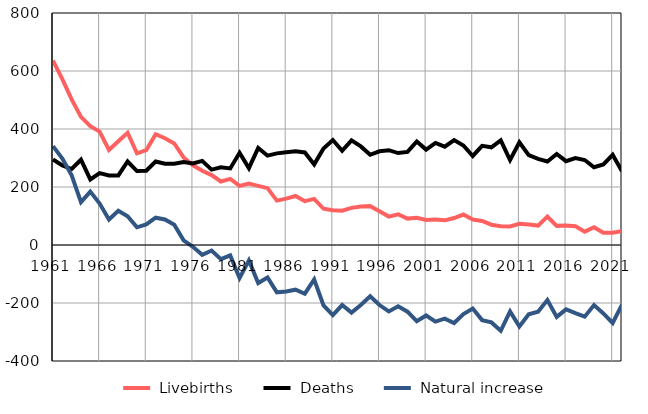
| Category |  Livebirths |  Deaths |  Natural increase |
|---|---|---|---|
| 1961.0 | 636 | 295 | 341 |
| 1962.0 | 572 | 274 | 298 |
| 1963.0 | 502 | 262 | 240 |
| 1964.0 | 442 | 294 | 148 |
| 1965.0 | 410 | 226 | 184 |
| 1966.0 | 391 | 248 | 143 |
| 1967.0 | 328 | 240 | 88 |
| 1968.0 | 358 | 240 | 118 |
| 1969.0 | 387 | 288 | 99 |
| 1970.0 | 316 | 255 | 61 |
| 1971.0 | 327 | 256 | 71 |
| 1972.0 | 382 | 288 | 94 |
| 1973.0 | 368 | 280 | 88 |
| 1974.0 | 350 | 280 | 70 |
| 1975.0 | 302 | 286 | 16 |
| 1976.0 | 275 | 281 | -6 |
| 1977.0 | 256 | 290 | -34 |
| 1978.0 | 241 | 260 | -19 |
| 1979.0 | 219 | 268 | -49 |
| 1980.0 | 228 | 264 | -36 |
| 1981.0 | 204 | 318 | -114 |
| 1982.0 | 212 | 265 | -53 |
| 1983.0 | 204 | 335 | -131 |
| 1984.0 | 196 | 308 | -112 |
| 1985.0 | 153 | 316 | -163 |
| 1986.0 | 160 | 320 | -160 |
| 1987.0 | 169 | 323 | -154 |
| 1988.0 | 151 | 319 | -168 |
| 1989.0 | 159 | 278 | -119 |
| 1990.0 | 125 | 333 | -208 |
| 1991.0 | 120 | 362 | -242 |
| 1992.0 | 118 | 325 | -207 |
| 1993.0 | 128 | 361 | -233 |
| 1994.0 | 133 | 340 | -207 |
| 1995.0 | 134 | 311 | -177 |
| 1996.0 | 116 | 323 | -207 |
| 1997.0 | 98 | 327 | -229 |
| 1998.0 | 106 | 317 | -211 |
| 1999.0 | 91 | 321 | -230 |
| 2000.0 | 94 | 357 | -263 |
| 2001.0 | 86 | 329 | -243 |
| 2002.0 | 88 | 352 | -264 |
| 2003.0 | 85 | 339 | -254 |
| 2004.0 | 93 | 362 | -269 |
| 2005.0 | 105 | 343 | -238 |
| 2006.0 | 88 | 307 | -219 |
| 2007.0 | 83 | 342 | -259 |
| 2008.0 | 70 | 337 | -267 |
| 2009.0 | 65 | 361 | -296 |
| 2010.0 | 64 | 293 | -229 |
| 2011.0 | 73 | 354 | -281 |
| 2012.0 | 71 | 310 | -239 |
| 2013.0 | 67 | 297 | -230 |
| 2014.0 | 98 | 288 | -190 |
| 2015.0 | 66 | 314 | -248 |
| 2016.0 | 67 | 289 | -222 |
| 2017.0 | 65 | 300 | -235 |
| 2018.0 | 46 | 293 | -247 |
| 2019.0 | 61 | 268 | -207 |
| 2020.0 | 42 | 278 | -236 |
| 2021.0 | 42 | 311 | -269 |
| 2022.0 | 48 | 254 | -206 |